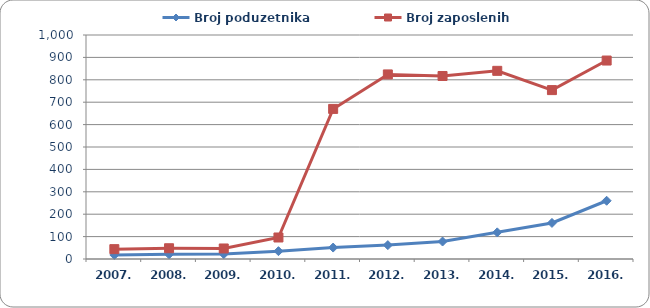
| Category | Broj poduzetnika  | Broj zaposlenih  |
|---|---|---|
| 2007. | 18 | 44 |
| 2008. | 21 | 48 |
| 2009. | 22 | 47 |
| 2010. | 35 | 96 |
| 2011. | 51 | 670 |
| 2012. | 62 | 824 |
| 2013. | 78 | 817 |
| 2014. | 119 | 840 |
| 2015. | 161 | 754 |
| 2016. | 260 | 886 |